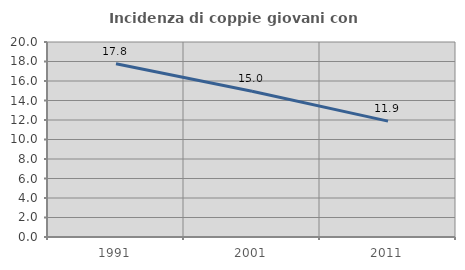
| Category | Incidenza di coppie giovani con figli |
|---|---|
| 1991.0 | 17.772 |
| 2001.0 | 14.958 |
| 2011.0 | 11.882 |